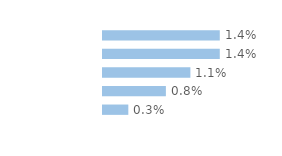
| Category | Series 0 |
|---|---|
| 18-29 ans | 0.014 |
| 30-39 ans | 0.014 |
| 40-49 ans | 0.011 |
| 50-59 ans | 0.008 |
| 60-75 ans | 0.003 |